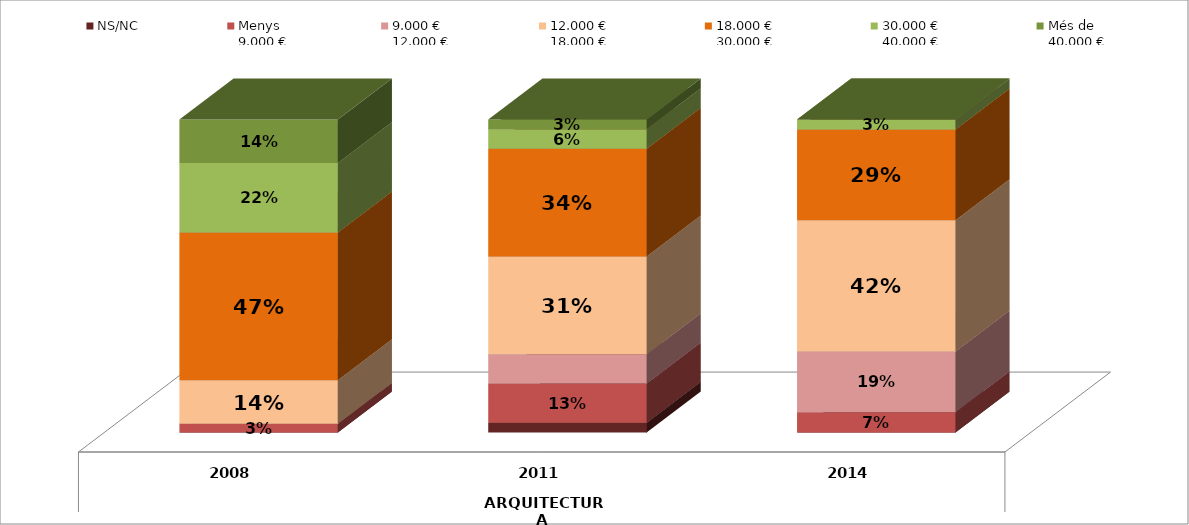
| Category | NS/NC | Menys 
9.000 € | 9.000 €
12.000 € | 12.000 €
18.000 € | Series 4 | 18.000 €
30.000 € | Series 6 | 30.000 €
40.000 € | Més de 
40.000 € |
|---|---|---|---|---|---|---|---|---|---|
| 0 | 0 | 0.028 | 0 | 0.139 |  | 0.472 |  | 0.222 | 0.139 |
| 1 | 0.031 | 0.125 | 0.094 | 0.312 |  | 0.344 |  | 0.062 | 0.031 |
| 2 | 0 | 0.065 | 0.194 | 0.419 |  | 0.29 |  | 0.032 | 0 |